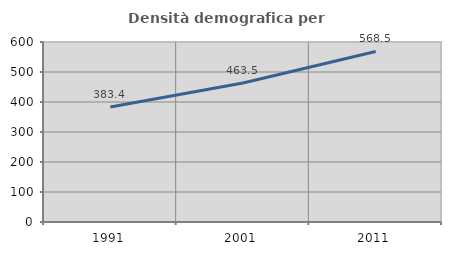
| Category | Densità demografica |
|---|---|
| 1991.0 | 383.44 |
| 2001.0 | 463.485 |
| 2011.0 | 568.514 |